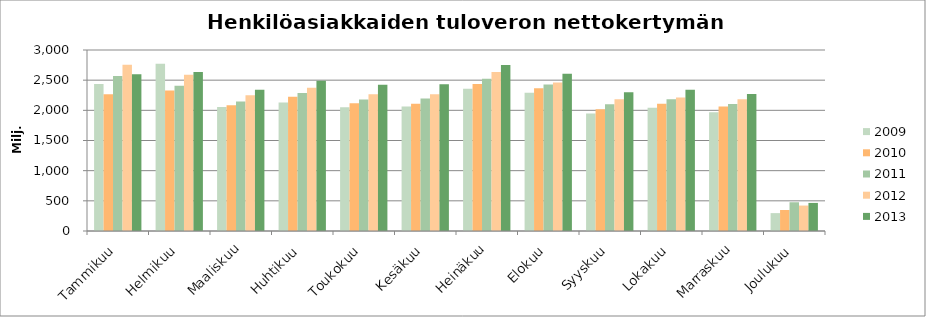
| Category | 2009 | 2010 | 2011 | 2012 | 2013 |
|---|---|---|---|---|---|
| Tammikuu | 2438.489 | 2267.873 | 2569.442 | 2754.468 | 2597.268 |
| Helmikuu | 2771.607 | 2330.409 | 2406.04 | 2591.616 | 2636.607 |
| Maaliskuu | 2054.852 | 2084.249 | 2145.291 | 2250.057 | 2340.316 |
| Huhtikuu | 2131.066 | 2225.487 | 2285.914 | 2375.631 | 2492.368 |
| Toukokuu | 2051.558 | 2117.095 | 2177.688 | 2264.689 | 2423.516 |
| Kesäkuu | 2063.182 | 2109.339 | 2194.481 | 2268.001 | 2432.777 |
| Heinäkuu | 2357.008 | 2435.026 | 2524.383 | 2633.57 | 2750.145 |
| Elokuu | 2289.863 | 2364.596 | 2427.052 | 2461.949 | 2607.529 |
| Syyskuu | 1946.167 | 2019.118 | 2102.001 | 2184.152 | 2299.363 |
| Lokakuu | 2041.676 | 2107.95 | 2185.045 | 2211.144 | 2342.648 |
| Marraskuu | 1967.798 | 2063.457 | 2106.752 | 2183.43 | 2270.307 |
| Joulukuu | 296.354 | 347.927 | 476.484 | 421.857 | 465.342 |